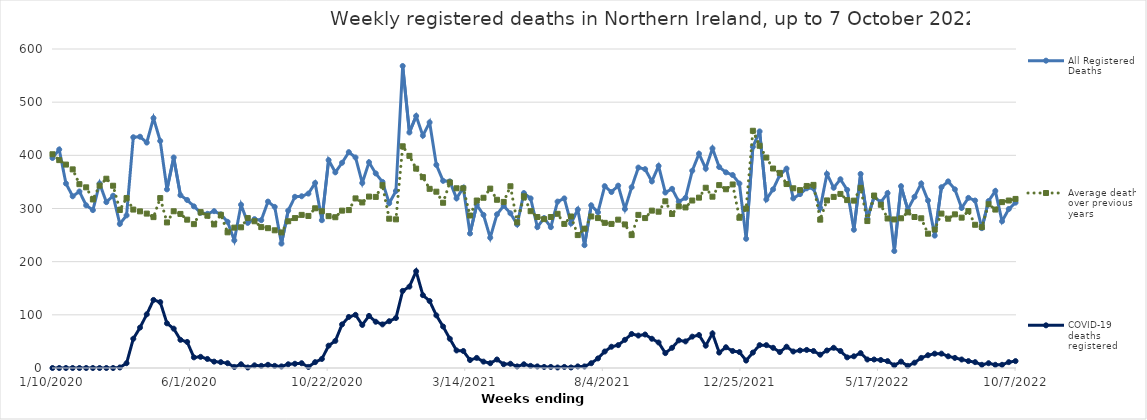
| Category | All Registered Deaths | Average deaths over previous 5 years | COVID-19 deaths registered |
|---|---|---|---|
| 1/10/20 | 395 | 402 | 0 |
| 1/17/20 | 411 | 391 | 0 |
| 1/24/20 | 347 | 382.6 | 0 |
| 1/31/20 | 323 | 373.6 | 0 |
| 2/7/20 | 332 | 345.8 | 0 |
| 2/14/20 | 306 | 339.8 | 0 |
| 2/21/20 | 297 | 317 | 0 |
| 2/28/20 | 347 | 343 | 0 |
| 3/6/20 | 312 | 356 | 0 |
| 3/13/20 | 324 | 342.8 | 0 |
| 3/20/20 | 271 | 297.2 | 1 |
| 3/27/20 | 287 | 319.6 | 9 |
| 4/3/20 | 434 | 298 | 55 |
| 4/10/20 | 435 | 294.6 | 76 |
| 4/17/20 | 424 | 290.4 | 101 |
| 4/24/20 | 470 | 283.8 | 128 |
| 5/1/20 | 427 | 319.6 | 124 |
| 5/8/20 | 336 | 273.8 | 84 |
| 5/15/20 | 396 | 294.8 | 74 |
| 5/22/20 | 325 | 289.8 | 53 |
| 5/29/20 | 316 | 279 | 49 |
| 6/5/20 | 304 | 270.6 | 20 |
| 6/12/20 | 292 | 293.2 | 21 |
| 6/19/20 | 290 | 286.4 | 17 |
| 6/26/20 | 295 | 270 | 12 |
| 7/3/20 | 289 | 288.2 | 11 |
| 7/10/20 | 275 | 255.2 | 9 |
| 7/17/20 | 240 | 264 | 2 |
| 7/24/20 | 307 | 264.6 | 7 |
| 7/31/20 | 273 | 282 | 1 |
| 8/7/20 | 280 | 276 | 5 |
| 8/14/20 | 278 | 265 | 4 |
| 8/21/20 | 313 | 263 | 6 |
| 8/28/20 | 303 | 259 | 4 |
| 9/4/20 | 234 | 255 | 3 |
| 9/11/20 | 296 | 276 | 7 |
| 9/18/20 | 322 | 282 | 8 |
| 9/25/20 | 323 | 288 | 9 |
| 10/2/20 | 328 | 286 | 2 |
| 10/9/20 | 348 | 300.4 | 11 |
| 10/16/20 | 278 | 294.8 | 17 |
| 10/23/20 | 391 | 285.6 | 42 |
| 10/30/20 | 368 | 283.6 | 51 |
| 11/6/20 | 386 | 296 | 82 |
| 11/13/20 | 406 | 297 | 96 |
| 11/20/20 | 396 | 319 | 100 |
| 11/27/20 | 348 | 311.4 | 81 |
| 12/4/20 | 387 | 322.4 | 98 |
| 12/11/20 | 366 | 321.8 | 87 |
| 12/18/20 | 350 | 343.8 | 82 |
| 12/25/20 | 310 | 280.8 | 88 |
| 1/1/21 | 333 | 279.6 | 94 |
| 1/8/21 | 568 | 417 | 145 |
| 1/15/21 | 443 | 399 | 153 |
| 1/22/21 | 474 | 375 | 182 |
| 1/29/21 | 437 | 359 | 137 |
| 2/5/21 | 462 | 337 | 126 |
| 2/12/21 | 382 | 331.6 | 99 |
| 2/19/21 | 352 | 310.8 | 78 |
| 2/26/21 | 351 | 349 | 55 |
| 3/5/21 | 319 | 338 | 33 |
| 3/12/21 | 339 | 338 | 32 |
| 3/19/21 | 253 | 286.8 | 15 |
| 3/26/21 | 307 | 315 | 19 |
| 4/2/21 | 288 | 320.2 | 12 |
| 4/9/21 | 245 | 337.4 | 9 |
| 4/16/21 | 289 | 316.4 | 16 |
| 4/23/21 | 305 | 312.4 | 7 |
| 4/30/21 | 291 | 341.8 | 8 |
| 5/7/21 | 270 | 274 | 3 |
| 5/14/21 | 329 | 323 | 7 |
| 5/21/21 | 319 | 295 | 4 |
| 5/28/21 | 265 | 284 | 3 |
| 6/4/21 | 282 | 280 | 2 |
| 6/11/21 | 265 | 284 | 2 |
| 6/18/21 | 313 | 290 | 1 |
| 6/25/21 | 319 | 271 | 2 |
| 7/2/21 | 272 | 285 | 1 |
| 7/9/21 | 298 | 250 | 3 |
| 7/16/21 | 231 | 262 | 3 |
| 7/23/21 | 306 | 285 | 9 |
| 7/30/21 | 293 | 282 | 18 |
| 8/6/21 | 342 | 273 | 31 |
| 8/13/21 | 331 | 271 | 40 |
| 8/20/21 | 343 | 279 | 43 |
| 8/27/21 | 299 | 270 | 53 |
| 9/3/21 | 340 | 250 | 64 |
| 9/10/21 | 377 | 288 | 61 |
| 9/17/21 | 374 | 282 | 63 |
| 9/24/21 | 351 | 296 | 55 |
| 10/1/21 | 380 | 294 | 48 |
| 10/8/21 | 330 | 313.6 | 28 |
| 10/15/21 | 337 | 289.6 | 38 |
| 10/22/21 | 313 | 304 | 52 |
| 10/29/21 | 320 | 302 | 50 |
| 11/5/21 | 371 | 315 | 59 |
| 11/12/21 | 403 | 320.4 | 62 |
| 11/19/21 | 375 | 339 | 42 |
| 11/26/21 | 413 | 322.2 | 65 |
| 12/3/21 | 378 | 344 | 29 |
| 12/10/21 | 368 | 336.2 | 39 |
| 12/17/21 | 363 | 345.2 | 32 |
| 12/24/21 | 347 | 282.6 | 30 |
| 12/31/21 | 243 | 299.8 | 14 |
| 1/7/22 | 416 | 446.2 | 29 |
| 1/14/22 | 445 | 418 | 43 |
| 1/21/22 | 317 | 395.8 | 43 |
| 1/28/22 | 336 | 375.2 | 38 |
| 2/4/22 | 363 | 367 | 30 |
| 2/11/22 | 375 | 346 | 40 |
| 2/18/22 | 319 | 338 | 31 |
| 2/25/22 | 327 | 334.6 | 33 |
| 3/4/22 | 338 | 342.4 | 34 |
| 3/11/22 | 338 | 344.4 | 32 |
| 3/18/22 | 301 | 279 | 25 |
| 3/25/22 | 365 | 315.2 | 33 |
| 4/1/22 | 339 | 321.8 | 38 |
| 4/8/22 | 355 | 327.4 | 32 |
| 4/15/22 | 335 | 315.8 | 20 |
| 4/22/22 | 260 | 314.8 | 22 |
| 4/29/22 | 365 | 338.8 | 28 |
| 5/6/22 | 281 | 276.4 | 16 |
| 5/13/22 | 322 | 324.4 | 16 |
| 5/20/22 | 312 | 307 | 15 |
| 5/27/22 | 329 | 281.2 | 13 |
| 6/3/22 | 220 | 279.4 | 5 |
| 6/10/22 | 342 | 281.6 | 12 |
| 6/17/22 | 298 | 292.8 | 4 |
| 6/24/22 | 322 | 284 | 10 |
| 7/1/22 | 347 | 281.6 | 19 |
| 7/8/22 | 315 | 252.6 | 24 |
| 7/15/22 | 249 | 260.4 | 27 |
| 7/22/22 | 340 | 290.4 | 27 |
| 7/29/22 | 351 | 280.8 | 22 |
| 8/5/22 | 336 | 289 | 19 |
| 8/12/22 | 301 | 282.8 | 16 |
| 8/19/22 | 320 | 295.2 | 13 |
| 8/26/22 | 315 | 269.4 | 11 |
| 9/2/22 | 263 | 265 | 6 |
| 9/9/22 | 314 | 308 | 9 |
| 9/16/22 | 333 | 298 | 6 |
| 9/23/22 | 276 | 312 | 6 |
| 9/30/22 | 299 | 315 | 11 |
| 10/7/22 | 311 | 318 | 13 |